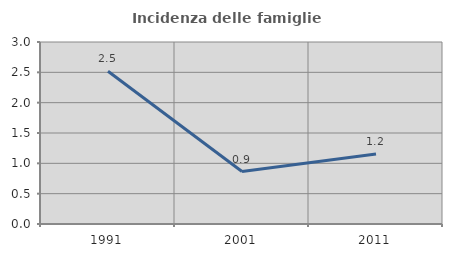
| Category | Incidenza delle famiglie numerose |
|---|---|
| 1991.0 | 2.519 |
| 2001.0 | 0.865 |
| 2011.0 | 1.153 |